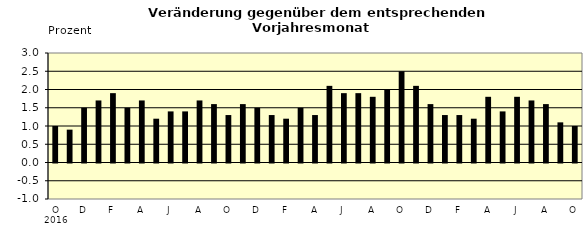
| Category | Series 0 |
|---|---|
| 0 | 1 |
| 1 | 0.9 |
| 2 | 1.5 |
| 3 | 1.7 |
| 4 | 1.9 |
| 5 | 1.5 |
| 6 | 1.7 |
| 7 | 1.2 |
| 8 | 1.4 |
| 9 | 1.4 |
| 10 | 1.7 |
| 11 | 1.6 |
| 12 | 1.3 |
| 13 | 1.6 |
| 14 | 1.5 |
| 15 | 1.3 |
| 16 | 1.2 |
| 17 | 1.5 |
| 18 | 1.3 |
| 19 | 2.1 |
| 20 | 1.9 |
| 21 | 1.9 |
| 22 | 1.8 |
| 23 | 2 |
| 24 | 2.5 |
| 25 | 2.1 |
| 26 | 1.6 |
| 27 | 1.3 |
| 28 | 1.3 |
| 29 | 1.2 |
| 30 | 1.8 |
| 31 | 1.4 |
| 32 | 1.8 |
| 33 | 1.7 |
| 34 | 1.6 |
| 35 | 1.1 |
| 36 | 1 |